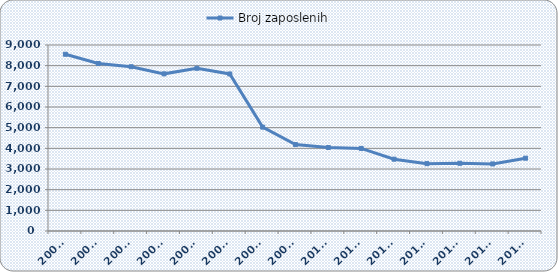
| Category | Broj zaposlenih |
|---|---|
| 2002. | 8552 |
| 2003. | 8105 |
| 2004. | 7949 |
| 2005. | 7604 |
| 2006. | 7874 |
| 2007. | 7599 |
| 2008. | 5026 |
| 2009. | 4183 |
| 2010. | 4039 |
| 2011. | 3995 |
| 2012. | 3475 |
| 2013. | 3260 |
| 2014. | 3276 |
| 2015. | 3245 |
| 2016. | 3523 |